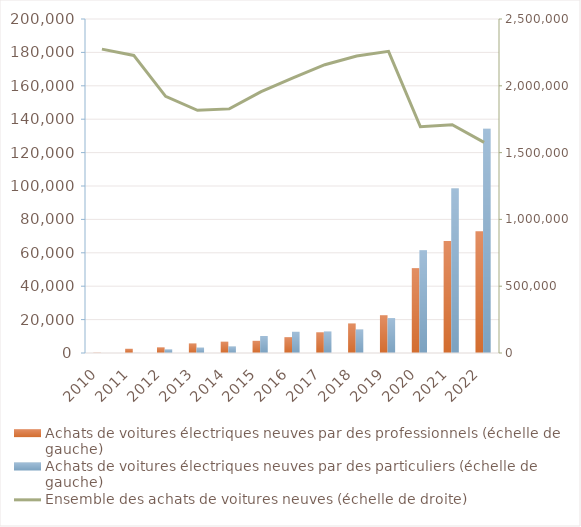
| Category | Achats de voitures électriques neuves par des professionnels (échelle de gauche) | Achats de voitures électriques neuves par des particuliers (échelle de gauche) |
|---|---|---|
| 2010.0 | 173 | 5 |
| 2011.0 | 2506 | 87 |
| 2012.0 | 3401 | 2196 |
| 2013.0 | 5665 | 3197 |
| 2014.0 | 6749 | 3873 |
| 2015.0 | 7275 | 10172 |
| 2016.0 | 9486 | 12681 |
| 2017.0 | 12412 | 12928 |
| 2018.0 | 17630 | 14044 |
| 2019.0 | 22631 | 20913 |
| 2020.0 | 50823 | 61577 |
| 2021.0 | 67046 | 98429 |
| 2022.0 | 72882 | 134289 |